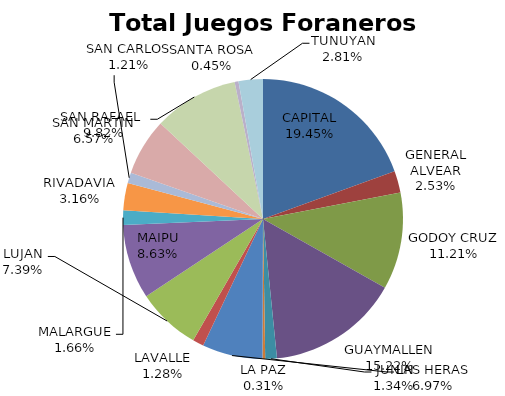
| Category | Total Juegos Foraneros Recaudación  |
|---|---|
| CAPITAL | 6804865 |
| GENERAL ALVEAR | 884646 |
| GODOY CRUZ | 3920285 |
| GUAYMALLEN | 5325872 |
| JUNIN | 469588 |
| LA PAZ | 108825 |
| LAS HERAS | 2438945 |
| LAVALLE | 446492 |
| LUJAN | 2584795 |
| MAIPU | 3017608 |
| MALARGUE | 581455 |
| RIVADAVIA | 1107229 |
| SAN CARLOS | 424747 |
| SAN MARTIN | 2297817 |
| SAN RAFAEL  | 3434701 |
| SANTA ROSA | 156453 |
| TUNUYAN | 981635 |